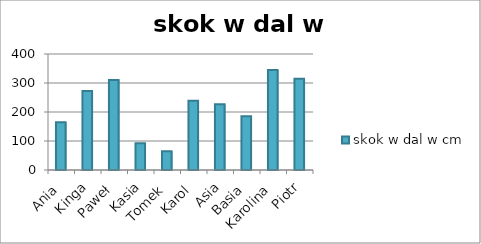
| Category | skok w dal w cm |
|---|---|
| Ania | 165 |
| Kinga | 272 |
| Paweł | 310 |
| Kasia | 92 |
| Tomek | 65 |
| Karol | 239 |
| Asia | 227 |
| Basia | 185 |
| Karolina | 345 |
| Piotr | 315 |